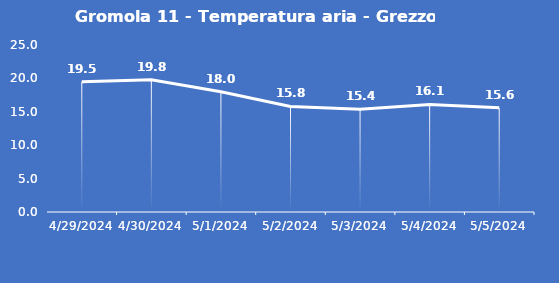
| Category | Gromola 11 - Temperatura aria - Grezzo (°C) |
|---|---|
| 4/29/24 | 19.5 |
| 4/30/24 | 19.8 |
| 5/1/24 | 18 |
| 5/2/24 | 15.8 |
| 5/3/24 | 15.4 |
| 5/4/24 | 16.1 |
| 5/5/24 | 15.6 |